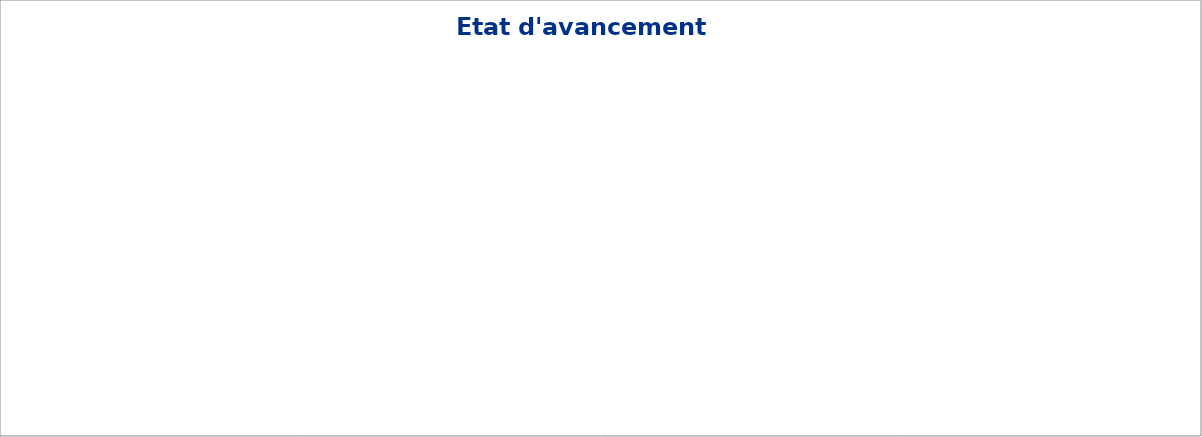
| Category | Series 1 |
|---|---|
| 4.1. Impartialité et Indépendance | 0 |
| 4.2. Confidentialité | 0 |
| 5.1. Exigences administratives | 0 |
| 6.1. Personnel | 0 |
| 6.2. Installations et Equipements | 0 |
| 6.3. Sous-traitance | 0 |
| 7.1. Méthodes et procédures d'inspection | 0 |
| 7.2. Manipulation des échantillons et objets présentés à l'inspection | 0 |
| 7.3. Enregistrements | 0 |
| 7.4. Rapports et certificats d'inspection | 0 |
| 8.2. Documentation du système de management | 0 |
| 8.3. Maîtrise des documents | 0 |
| 8.4. Maîtrise des enregistrements | 0 |
| 8.5. Revue de direction | 0 |
| 8.6. Audit interne | 0 |
| 8.7. Actions correctives / 8.8 Actions préventives | 0 |